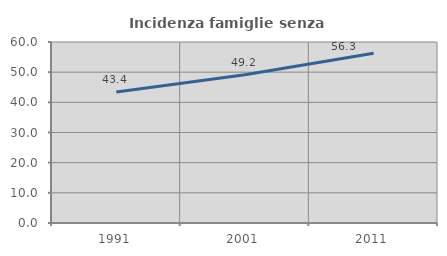
| Category | Incidenza famiglie senza nuclei |
|---|---|
| 1991.0 | 43.396 |
| 2001.0 | 49.153 |
| 2011.0 | 56.25 |